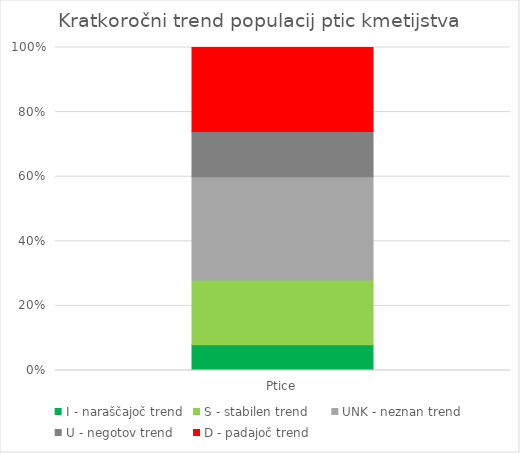
| Category | I - naraščajoč trend | S - stabilen trend | UNK - neznan trend | U - negotov trend | D - padajoč trend |
|---|---|---|---|---|---|
| Ptice | 4 | 10 | 16 | 7 | 13 |